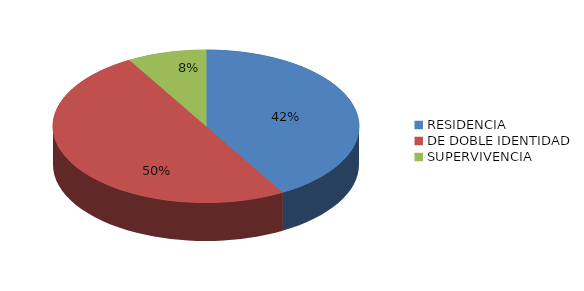
| Category | Series 0 |
|---|---|
| RESIDENCIA | 5 |
| DE DOBLE IDENTIDAD | 6 |
| SUPERVIVENCIA | 1 |